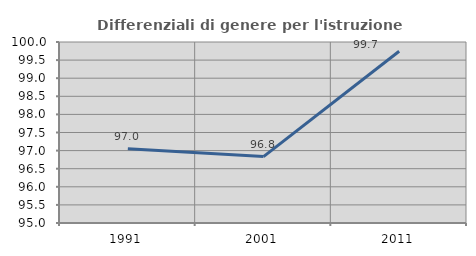
| Category | Differenziali di genere per l'istruzione superiore |
|---|---|
| 1991.0 | 97.049 |
| 2001.0 | 96.835 |
| 2011.0 | 99.743 |